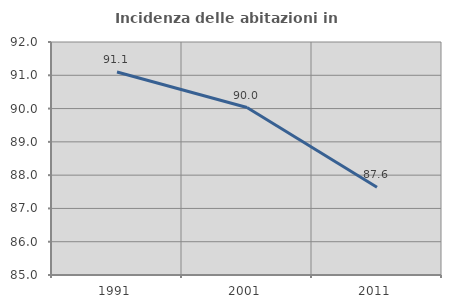
| Category | Incidenza delle abitazioni in proprietà  |
|---|---|
| 1991.0 | 91.098 |
| 2001.0 | 90.032 |
| 2011.0 | 87.635 |